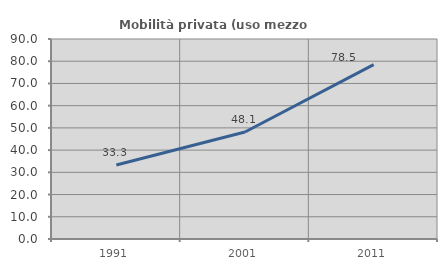
| Category | Mobilità privata (uso mezzo privato) |
|---|---|
| 1991.0 | 33.333 |
| 2001.0 | 48.148 |
| 2011.0 | 78.481 |